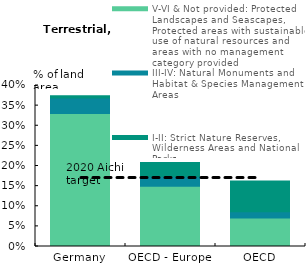
| Category | V-VI & Not provided: Protected Landscapes and Seascapes, Protected areas with sustainable use of natural resources and areas with no management category provided | III-IV: Natural Monuments and Habitat & Species Management Areas | I-II: Strict Nature Reserves, Wilderness Areas and National Parks |
|---|---|---|---|
| Germany | 0.33 | 0.039 | 0.005 |
| OECD - Europe | 0.15 | 0.024 | 0.035 |
| OECD | 0.071 | 0.016 | 0.076 |